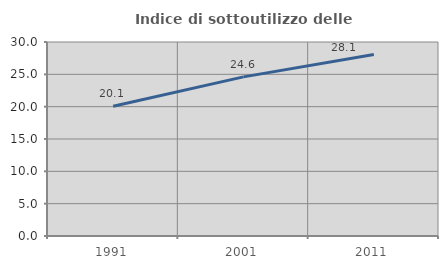
| Category | Indice di sottoutilizzo delle abitazioni  |
|---|---|
| 1991.0 | 20.069 |
| 2001.0 | 24.604 |
| 2011.0 | 28.071 |